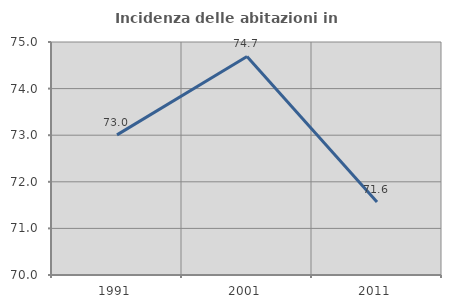
| Category | Incidenza delle abitazioni in proprietà  |
|---|---|
| 1991.0 | 73.007 |
| 2001.0 | 74.691 |
| 2011.0 | 71.567 |